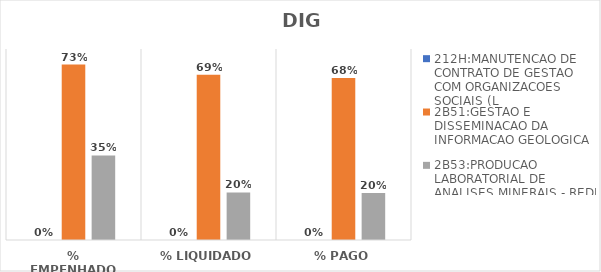
| Category | 212H:MANUTENCAO DE CONTRATO DE GESTAO COM ORGANIZACOES SOCIAIS (L | 2B51:GESTAO E DISSEMINACAO DA INFORMACAO GEOLOGICA | 2B53:PRODUCAO LABORATORIAL DE ANALISES MINERAIS - REDE LAMIN |
|---|---|---|---|
| % EMPENHADO | 0 | 0.735 | 0.354 |
| % LIQUIDADO | 0 | 0.692 | 0.199 |
| % PAGO | 0 | 0.678 | 0.197 |